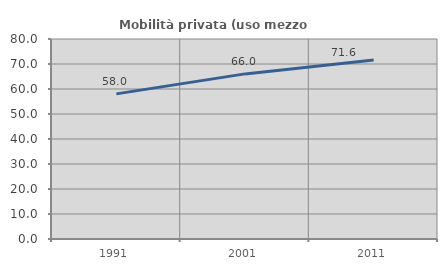
| Category | Mobilità privata (uso mezzo privato) |
|---|---|
| 1991.0 | 58.043 |
| 2001.0 | 66.045 |
| 2011.0 | 71.631 |